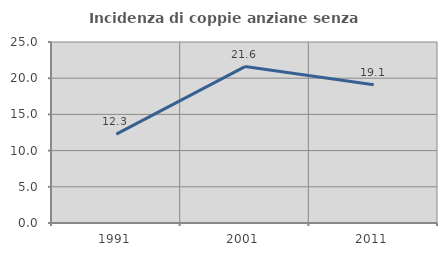
| Category | Incidenza di coppie anziane senza figli  |
|---|---|
| 1991.0 | 12.27 |
| 2001.0 | 21.605 |
| 2011.0 | 19.108 |